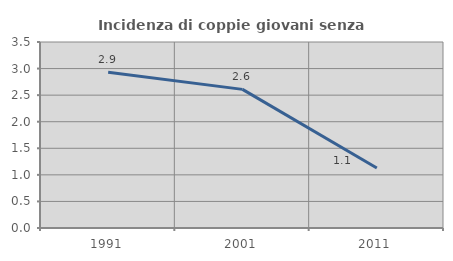
| Category | Incidenza di coppie giovani senza figli |
|---|---|
| 1991.0 | 2.93 |
| 2001.0 | 2.609 |
| 2011.0 | 1.13 |